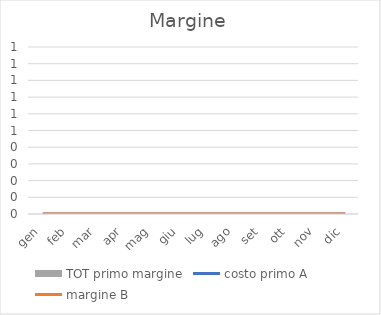
| Category | TOT primo margine |
|---|---|
| gen | 0 |
| feb | 0 |
| mar | 0 |
| apr | 0 |
| mag | 0 |
| giu | 0 |
| lug | 0 |
| ago | 0 |
| set | 0 |
| ott | 0 |
| nov | 0 |
| dic | 0 |